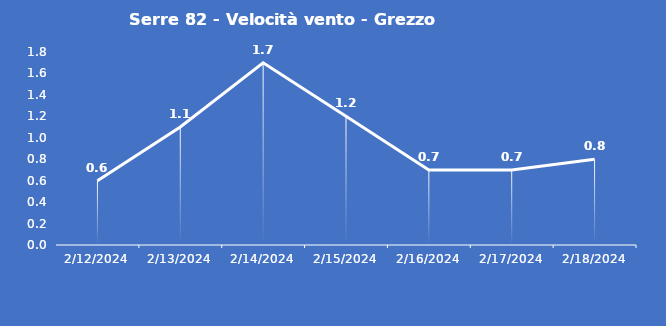
| Category | Serre 82 - Velocità vento - Grezzo (m/s) |
|---|---|
| 2/12/24 | 0.6 |
| 2/13/24 | 1.1 |
| 2/14/24 | 1.7 |
| 2/15/24 | 1.2 |
| 2/16/24 | 0.7 |
| 2/17/24 | 0.7 |
| 2/18/24 | 0.8 |